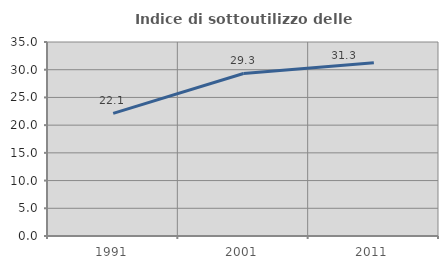
| Category | Indice di sottoutilizzo delle abitazioni  |
|---|---|
| 1991.0 | 22.115 |
| 2001.0 | 29.328 |
| 2011.0 | 31.274 |